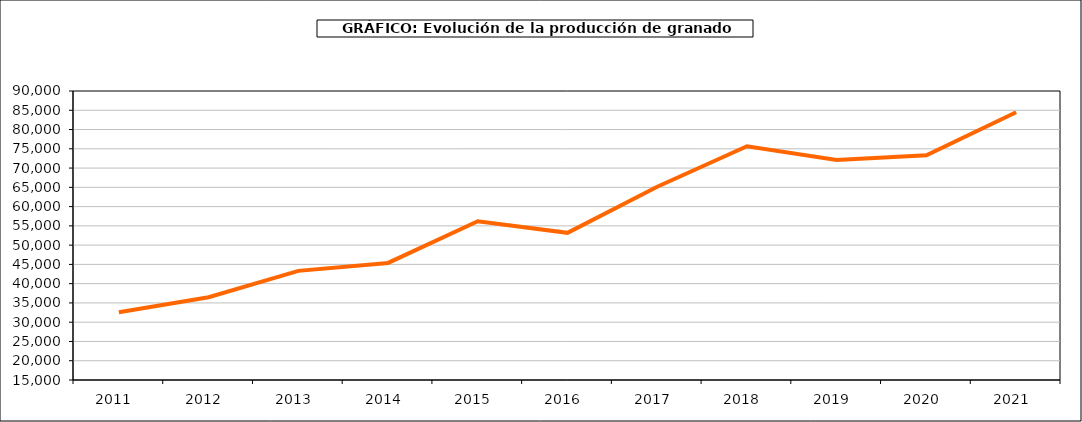
| Category | producción granado |
|---|---|
| 2011.0 | 32606 |
| 2012.0 | 36495 |
| 2013.0 | 43324 |
| 2014.0 | 45382 |
| 2015.0 | 56185 |
| 2016.0 | 53187 |
| 2017.0 | 65165 |
| 2018.0 | 75673 |
| 2019.0 | 72115 |
| 2020.0 | 73341 |
| 2021.0 | 84477 |